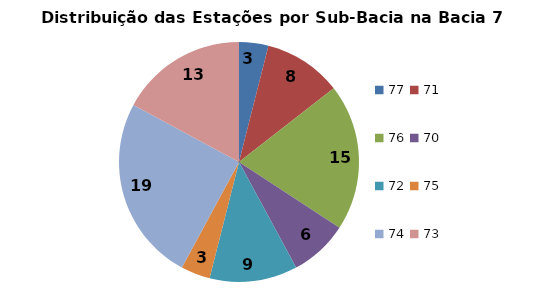
| Category | N° de Estaçõesb |
|---|---|
| 77.0 | 3 |
| 71.0 | 8 |
| 76.0 | 15 |
| 70.0 | 6 |
| 72.0 | 9 |
| 75.0 | 3 |
| 74.0 | 19 |
| 73.0 | 13 |